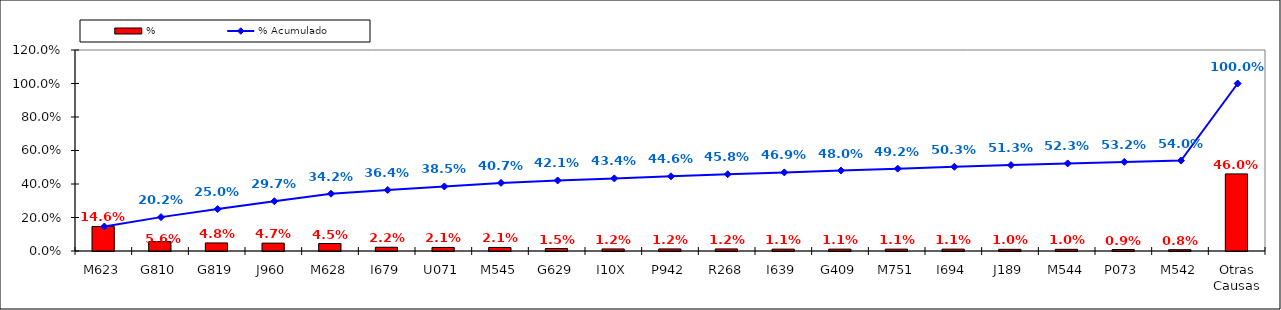
| Category | % |
|---|---|
| M623 | 0.146 |
| G810 | 0.056 |
| G819 | 0.048 |
| J960 | 0.047 |
| M628 | 0.045 |
| I679 | 0.022 |
| U071 | 0.021 |
| M545 | 0.021 |
| G629 | 0.015 |
| I10X | 0.012 |
| P942 | 0.012 |
| R268 | 0.012 |
| I639 | 0.011 |
| G409 | 0.011 |
| M751 | 0.011 |
| I694 | 0.011 |
| J189 | 0.01 |
| M544 | 0.01 |
| P073 | 0.009 |
| M542 | 0.008 |
| Otras Causas | 0.46 |